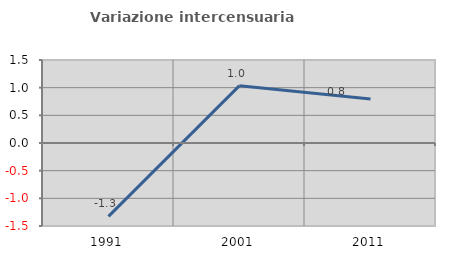
| Category | Variazione intercensuaria annua |
|---|---|
| 1991.0 | -1.326 |
| 2001.0 | 1.036 |
| 2011.0 | 0.796 |